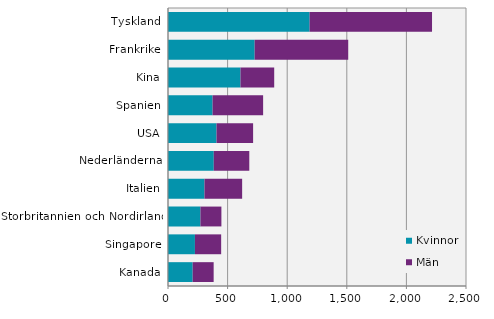
| Category | Kvinnor | Män |
|---|---|---|
| Tyskland | 1188 | 1027 |
| Frankrike | 727 | 785 |
| Kina | 608 | 283 |
| Spanien | 374 | 424 |
| USA | 407 | 307 |
| Nederländerna | 384 | 298 |
| Italien | 306 | 316 |
| Storbritannien och Nordirland | 272 | 176 |
| Singapore | 226 | 220 |
| Kanada | 207 | 176 |